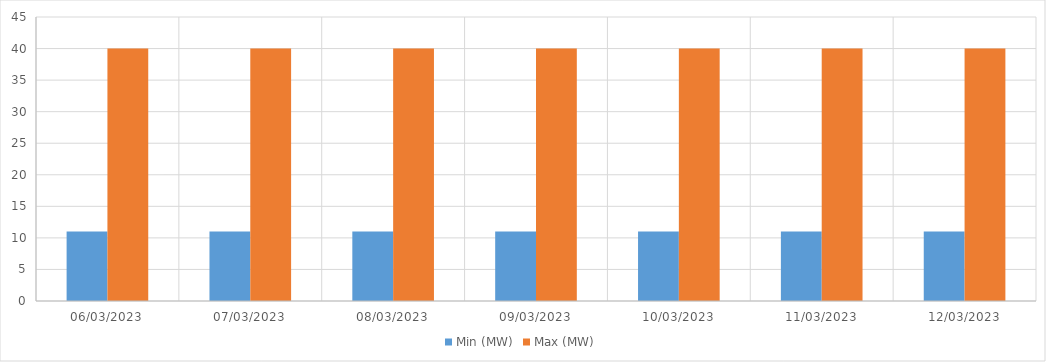
| Category | Min (MW) | Max (MW) |
|---|---|---|
| 06/03/2023 | 11 | 40 |
| 07/03/2023 | 11 | 40 |
| 08/03/2023 | 11 | 40 |
| 09/03/2023 | 11 | 40 |
| 10/03/2023 | 11 | 40 |
| 11/03/2023 | 11 | 40 |
| 12/03/2023 | 11 | 40 |